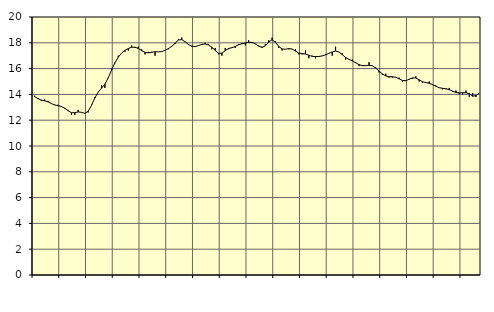
| Category | Piggar | Series 1 |
|---|---|---|
| nan | 13.9 | 13.82 |
| 87.0 | 13.7 | 13.67 |
| 87.0 | 13.5 | 13.56 |
| 87.0 | 13.6 | 13.5 |
| nan | 13.5 | 13.42 |
| 88.0 | 13.3 | 13.29 |
| 88.0 | 13.2 | 13.18 |
| 88.0 | 13.2 | 13.12 |
| nan | 13.1 | 13.06 |
| 89.0 | 12.9 | 12.93 |
| 89.0 | 12.8 | 12.74 |
| 89.0 | 12.4 | 12.58 |
| nan | 12.4 | 12.58 |
| 90.0 | 12.8 | 12.64 |
| 90.0 | 12.6 | 12.61 |
| 90.0 | 12.5 | 12.53 |
| nan | 12.6 | 12.69 |
| 91.0 | 13.2 | 13.15 |
| 91.0 | 13.8 | 13.72 |
| 91.0 | 14.2 | 14.18 |
| nan | 14.7 | 14.48 |
| 92.0 | 14.5 | 14.8 |
| 92.0 | 15.3 | 15.28 |
| 92.0 | 16 | 15.88 |
| nan | 16.4 | 16.45 |
| 93.0 | 17 | 16.89 |
| 93.0 | 17.2 | 17.2 |
| 93.0 | 17.3 | 17.41 |
| nan | 17.4 | 17.56 |
| 94.0 | 17.8 | 17.65 |
| 94.0 | 17.6 | 17.66 |
| 94.0 | 17.7 | 17.56 |
| nan | 17.5 | 17.4 |
| 95.0 | 17.1 | 17.26 |
| 95.0 | 17.3 | 17.22 |
| 95.0 | 17.3 | 17.27 |
| nan | 17 | 17.3 |
| 96.0 | 17.3 | 17.3 |
| 96.0 | 17.3 | 17.32 |
| 96.0 | 17.4 | 17.42 |
| nan | 17.5 | 17.55 |
| 97.0 | 17.7 | 17.72 |
| 97.0 | 17.9 | 17.97 |
| 97.0 | 18.3 | 18.21 |
| nan | 18.4 | 18.25 |
| 98.0 | 18.1 | 18.08 |
| 98.0 | 17.9 | 17.86 |
| 98.0 | 17.7 | 17.74 |
| nan | 17.7 | 17.71 |
| 99.0 | 17.8 | 17.78 |
| 99.0 | 17.9 | 17.88 |
| 99.0 | 18 | 17.91 |
| nan | 17.9 | 17.83 |
| 0.0 | 17.5 | 17.66 |
| 0.0 | 17.6 | 17.41 |
| 0.0 | 17.1 | 17.19 |
| nan | 17 | 17.2 |
| 1.0 | 17.6 | 17.39 |
| 1.0 | 17.5 | 17.56 |
| 1.0 | 17.6 | 17.62 |
| nan | 17.6 | 17.72 |
| 2.0 | 17.9 | 17.85 |
| 2.0 | 18 | 17.92 |
| 2.0 | 17.8 | 17.99 |
| nan | 18.2 | 18.04 |
| 3.0 | 18 | 18.03 |
| 3.0 | 17.9 | 17.92 |
| 3.0 | 17.8 | 17.74 |
| nan | 17.7 | 17.64 |
| 4.0 | 17.9 | 17.76 |
| 4.0 | 18.2 | 18.06 |
| 4.0 | 18.4 | 18.23 |
| nan | 18.1 | 18.06 |
| 5.0 | 17.6 | 17.72 |
| 5.0 | 17.4 | 17.52 |
| 5.0 | 17.5 | 17.5 |
| nan | 17.5 | 17.55 |
| 6.0 | 17.5 | 17.52 |
| 6.0 | 17.5 | 17.36 |
| 6.0 | 17.1 | 17.21 |
| nan | 17.1 | 17.16 |
| 7.0 | 17.4 | 17.13 |
| 7.0 | 16.8 | 17.04 |
| 7.0 | 17 | 16.95 |
| nan | 16.8 | 16.93 |
| 8.0 | 16.9 | 16.94 |
| 8.0 | 17 | 16.98 |
| 8.0 | 17.1 | 17.07 |
| nan | 17.2 | 17.18 |
| 9.0 | 17 | 17.29 |
| 9.0 | 17.7 | 17.36 |
| 9.0 | 17.3 | 17.29 |
| nan | 17.2 | 17.08 |
| 10.0 | 16.7 | 16.87 |
| 10.0 | 16.7 | 16.72 |
| 10.0 | 16.7 | 16.6 |
| nan | 16.5 | 16.45 |
| 11.0 | 16.2 | 16.31 |
| 11.0 | 16.2 | 16.23 |
| 11.0 | 16.2 | 16.23 |
| nan | 16.5 | 16.26 |
| 12.0 | 16.2 | 16.22 |
| 12.0 | 16.1 | 16.05 |
| 12.0 | 15.7 | 15.81 |
| nan | 15.5 | 15.59 |
| 13.0 | 15.6 | 15.43 |
| 13.0 | 15.3 | 15.37 |
| 13.0 | 15.3 | 15.37 |
| nan | 15.3 | 15.33 |
| 14.0 | 15.3 | 15.21 |
| 14.0 | 15 | 15.08 |
| 14.0 | 15.1 | 15.06 |
| nan | 15.2 | 15.17 |
| 15.0 | 15.2 | 15.28 |
| 15.0 | 15.4 | 15.27 |
| 15.0 | 15 | 15.13 |
| nan | 14.9 | 14.98 |
| 16.0 | 14.9 | 14.92 |
| 16.0 | 15 | 14.86 |
| 16.0 | 14.8 | 14.76 |
| nan | 14.7 | 14.63 |
| 17.0 | 14.5 | 14.52 |
| 17.0 | 14.4 | 14.47 |
| 17.0 | 14.4 | 14.44 |
| nan | 14.5 | 14.37 |
| 18.0 | 14.2 | 14.26 |
| 18.0 | 14.3 | 14.15 |
| 18.0 | 14 | 14.12 |
| nan | 14 | 14.13 |
| 19.0 | 14.3 | 14.13 |
| 19.0 | 13.8 | 14.06 |
| 19.0 | 14.1 | 13.86 |
| nan | 13.8 | 13.91 |
| 20.0 | 14.1 | 14.1 |